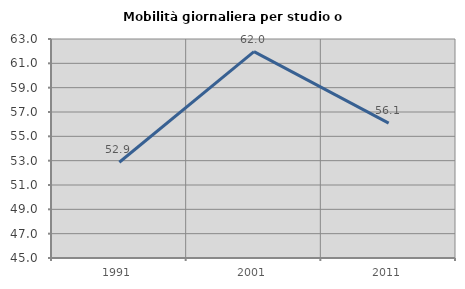
| Category | Mobilità giornaliera per studio o lavoro |
|---|---|
| 1991.0 | 52.87 |
| 2001.0 | 61.961 |
| 2011.0 | 56.082 |